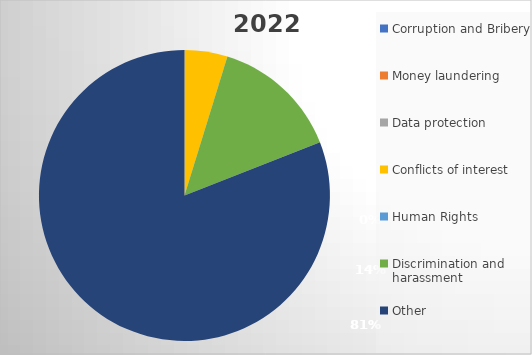
| Category | 2023 |
|---|---|
| Corruption and Bribery | 0 |
| Money laundering | 0 |
| Data protection | 0 |
| Conflicts of interest | 1 |
| Human Rights | 0 |
| Discrimination and harassment | 3 |
| Other | 17 |